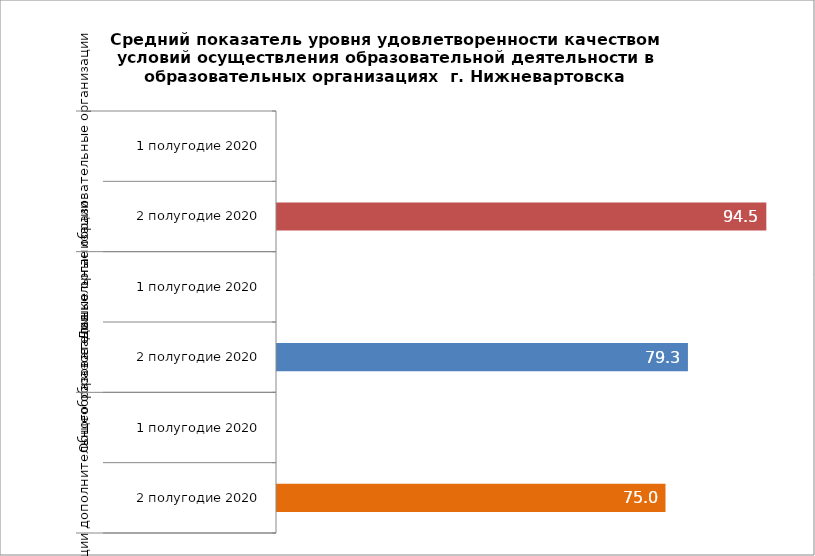
| Category | Series 0 |
|---|---|
| 0 | 0 |
| 1 | 94.462 |
| 2 | 0 |
| 3 | 79.33 |
| 4 | 0 |
| 5 | 75 |